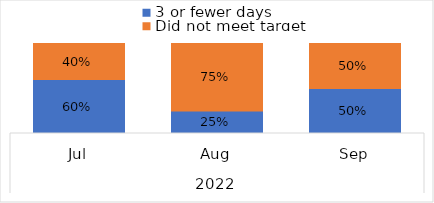
| Category | 3 or fewer days | Did not meet target |
|---|---|---|
| 0 | 0.6 | 0.4 |
| 1 | 0.25 | 0.75 |
| 2 | 0.5 | 0.5 |